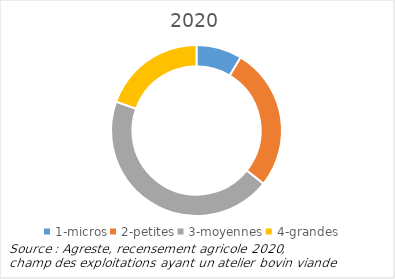
| Category | 2020 |
|---|---|
| 1-micros | 304 |
| 2-petites | 950 |
| 3-moyennes | 1573 |
| 4-grandes | 685 |